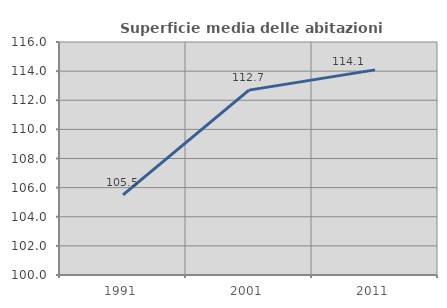
| Category | Superficie media delle abitazioni occupate |
|---|---|
| 1991.0 | 105.503 |
| 2001.0 | 112.695 |
| 2011.0 | 114.085 |